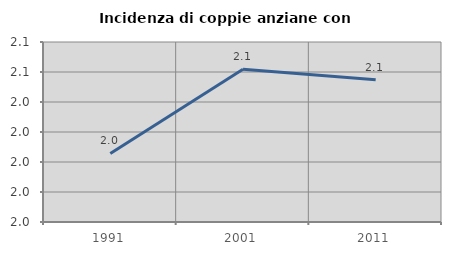
| Category | Incidenza di coppie anziane con figli |
|---|---|
| 1991.0 | 2.006 |
| 2001.0 | 2.062 |
| 2011.0 | 2.055 |